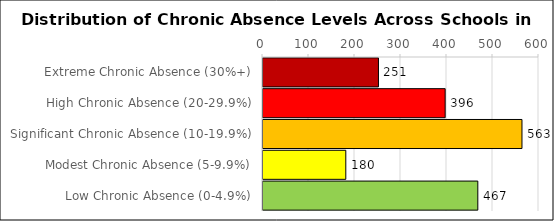
| Category | Number of Schools |
|---|---|
| Extreme Chronic Absence (30%+) | 251 |
| High Chronic Absence (20-29.9%) | 396 |
| Significant Chronic Absence (10-19.9%) | 563 |
| Modest Chronic Absence (5-9.9%) | 180 |
| Low Chronic Absence (0-4.9%) | 467 |